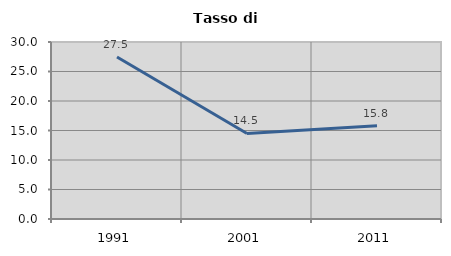
| Category | Tasso di disoccupazione   |
|---|---|
| 1991.0 | 27.46 |
| 2001.0 | 14.498 |
| 2011.0 | 15.824 |